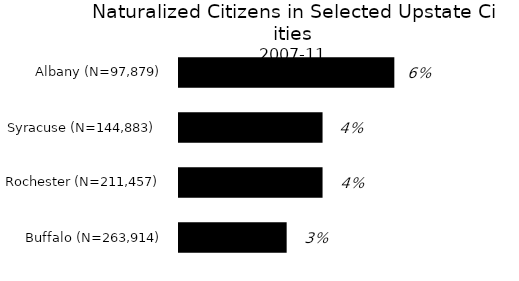
| Category | Series 0 |
|---|---|
| Buffalo (N=263,914) | 0.03 |
| Rochester (N=211,457) | 0.04 |
| Syracuse (N=144,883)  | 0.04 |
| Albany (N=97,879) | 0.06 |